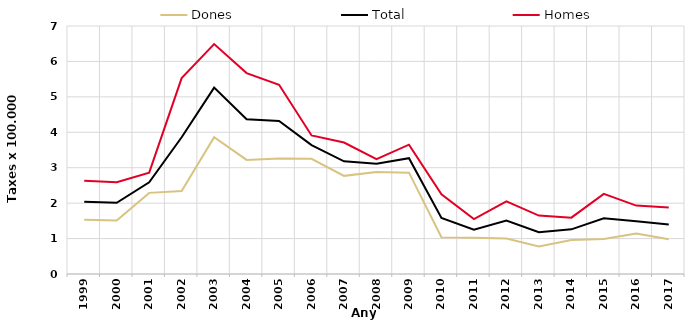
| Category | Dones | Total | Homes |
|---|---|---|---|
| 1999.0 | 1.53 | 2.04 | 2.63 |
| 2000.0 | 1.51 | 2.01 | 2.59 |
| 2001.0 | 2.29 | 2.59 | 2.86 |
| 2002.0 | 2.34 | 3.86 | 5.53 |
| 2003.0 | 3.86 | 5.26 | 6.49 |
| 2004.0 | 3.22 | 4.37 | 5.67 |
| 2005.0 | 3.26 | 4.32 | 5.34 |
| 2006.0 | 3.25 | 3.64 | 3.91 |
| 2007.0 | 2.77 | 3.18 | 3.71 |
| 2008.0 | 2.88 | 3.11 | 3.24 |
| 2009.0 | 2.86 | 3.27 | 3.65 |
| 2010.0 | 1.04 | 1.58 | 2.25 |
| 2011.0 | 1.02 | 1.25 | 1.55 |
| 2012.0 | 1 | 1.51 | 2.05 |
| 2013.0 | 0.78 | 1.18 | 1.65 |
| 2014.0 | 0.96 | 1.26 | 1.59 |
| 2015.0 | 0.99 | 1.57 | 2.26 |
| 2016.0 | 1.14 | 1.49 | 1.93 |
| 2017.0 | 0.98 | 1.4 | 1.88 |